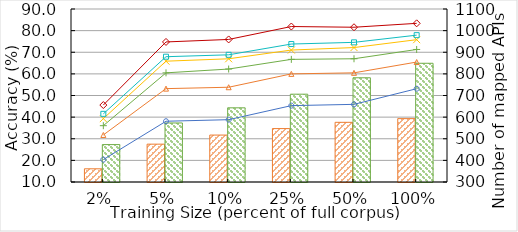
| Category | # seen C# API | # seen Java API |
|---|---|---|
| 0.02 | 361 | 473 |
| 0.05 | 475 | 573 |
| 0.1 | 517 | 643 |
| 0.25 | 547 | 706 |
| 0.5 | 576 | 782 |
| 1.0 | 593 | 849 |